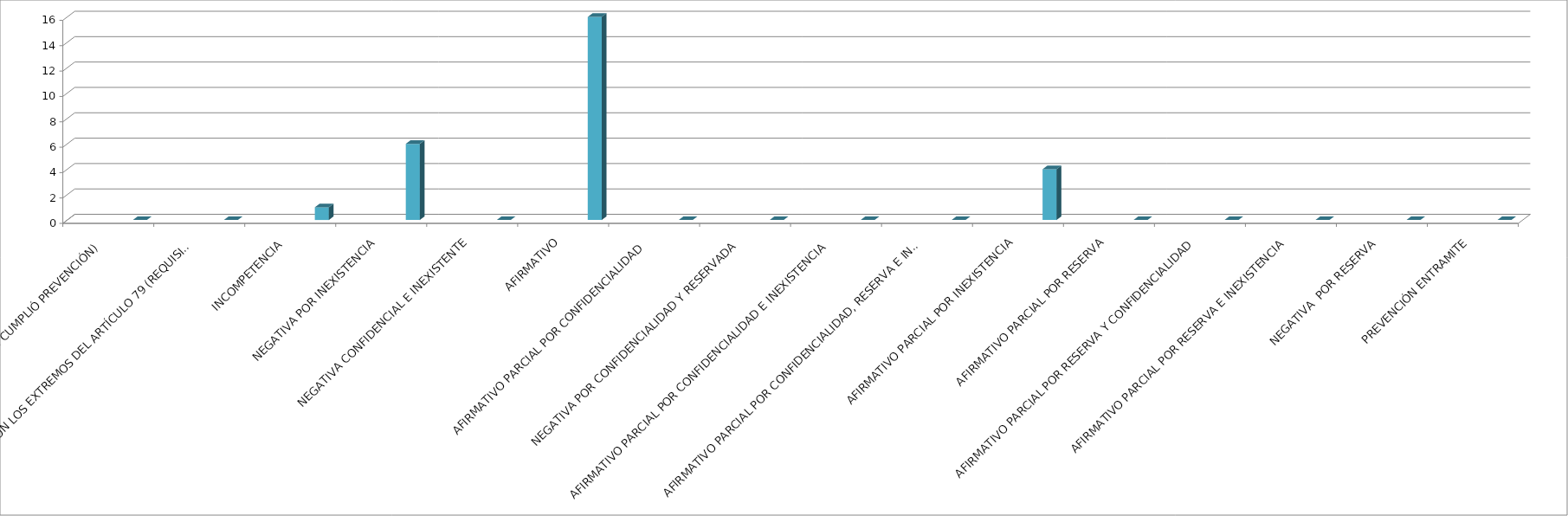
| Category | Series 0 | Series 1 | Series 2 | Series 3 | Series 4 |
|---|---|---|---|---|---|
| SE TIENE POR NO PRESENTADA ( NO CUMPLIÓ PREVENCIÓN) |  |  |  |  | 0 |
| NO CUMPLIO CON LOS EXTREMOS DEL ARTÍCULO 79 (REQUISITOS) |  |  |  |  | 0 |
| INCOMPETENCIA  |  |  |  |  | 1 |
| NEGATIVA POR INEXISTENCIA |  |  |  |  | 6 |
| NEGATIVA CONFIDENCIAL E INEXISTENTE |  |  |  |  | 0 |
| AFIRMATIVO |  |  |  |  | 16 |
| AFIRMATIVO PARCIAL POR CONFIDENCIALIDAD  |  |  |  |  | 0 |
| NEGATIVA POR CONFIDENCIALIDAD Y RESERVADA |  |  |  |  | 0 |
| AFIRMATIVO PARCIAL POR CONFIDENCIALIDAD E INEXISTENCIA |  |  |  |  | 0 |
| AFIRMATIVO PARCIAL POR CONFIDENCIALIDAD, RESERVA E INEXISTENCIA |  |  |  |  | 0 |
| AFIRMATIVO PARCIAL POR INEXISTENCIA |  |  |  |  | 4 |
| AFIRMATIVO PARCIAL POR RESERVA |  |  |  |  | 0 |
| AFIRMATIVO PARCIAL POR RESERVA Y CONFIDENCIALIDAD |  |  |  |  | 0 |
| AFIRMATIVO PARCIAL POR RESERVA E INEXISTENCIA |  |  |  |  | 0 |
| NEGATIVA  POR RESERVA |  |  |  |  | 0 |
| PREVENCIÓN ENTRAMITE |  |  |  |  | 0 |